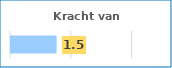
| Category | Series 0 |
|---|---|
| 0 | 1.5 |